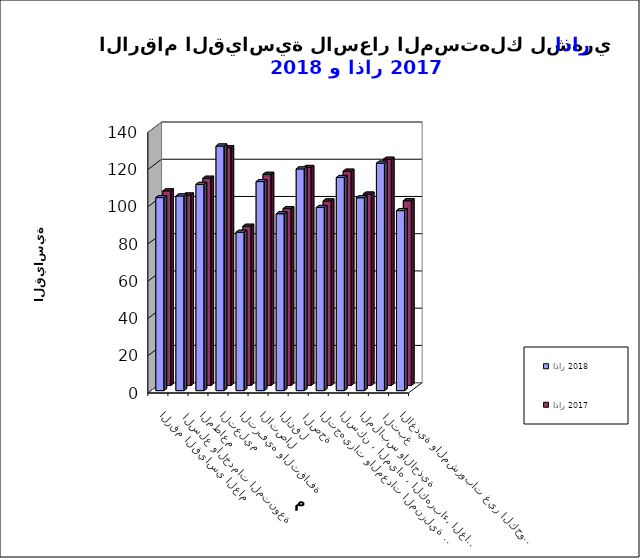
| Category | اذار 2018      | اذار 2017 |
|---|---|---|
| الاغذية والمشروبات غير الكحولية | 96.7 | 99.2 |
|  التبغ | 122.2 | 121.5 |
| الملابس والاحذية | 103.6 | 102.8 |
| السكن ، المياه ، الكهرباء، الغاز  | 114.5 | 115.1 |
| التجهيزات والمعدات المنزلية والصيانة | 98.4 | 99.1 |
|  الصحة | 119.1 | 117.1 |
| النقل | 95 | 95 |
| الاتصال | 112.3 | 113.4 |
| الترفيه والثقافة | 85.1 | 85.5 |
| التعليم | 131.4 | 127.7 |
| المطاعم  | 110.8 | 111.3 |
|  السلع والخدمات المتنوعة | 104.6 | 102.3 |
| الرقم القياسي العام | 103.7 | 104.5 |